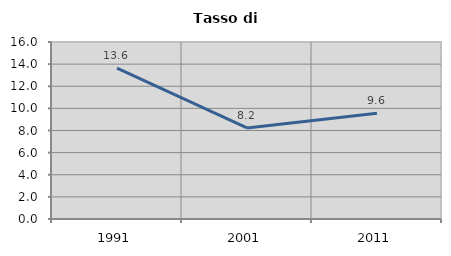
| Category | Tasso di disoccupazione   |
|---|---|
| 1991.0 | 13.644 |
| 2001.0 | 8.235 |
| 2011.0 | 9.554 |